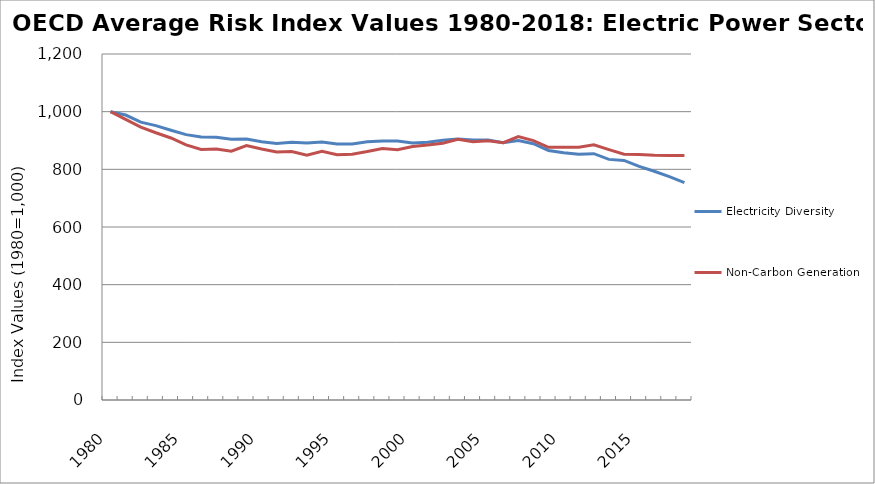
| Category | Electricity Diversity | Non-Carbon Generation |
|---|---|---|
| 1980.0 | 1000 | 1000 |
| 1981.0 | 988.271 | 973.074 |
| 1982.0 | 963.545 | 946.455 |
| 1983.0 | 951.46 | 926.827 |
| 1984.0 | 935.702 | 908.792 |
| 1985.0 | 920.39 | 884.839 |
| 1986.0 | 911.85 | 869.063 |
| 1987.0 | 911.318 | 870.815 |
| 1988.0 | 904.675 | 862.834 |
| 1989.0 | 904.932 | 882.467 |
| 1990.0 | 895.619 | 870.305 |
| 1991.0 | 889.67 | 860.39 |
| 1992.0 | 894.015 | 861.613 |
| 1993.0 | 891.215 | 849.217 |
| 1994.0 | 894.467 | 862.685 |
| 1995.0 | 887.855 | 850.986 |
| 1996.0 | 888.103 | 852.672 |
| 1997.0 | 895.527 | 861.629 |
| 1998.0 | 897.985 | 872.331 |
| 1999.0 | 898.181 | 867.958 |
| 2000.0 | 891.257 | 878.933 |
| 2001.0 | 894.192 | 884.568 |
| 2002.0 | 901.116 | 890.29 |
| 2003.0 | 904.868 | 904.165 |
| 2004.0 | 901.401 | 895.276 |
| 2005.0 | 901.718 | 898.986 |
| 2006.0 | 891.921 | 892.38 |
| 2007.0 | 899.771 | 913.777 |
| 2008.0 | 889.016 | 899.574 |
| 2009.0 | 865.443 | 876.252 |
| 2010.0 | 857.338 | 876.191 |
| 2011.0 | 851.954 | 876.976 |
| 2012.0 | 854.164 | 884.778 |
| 2013.0 | 834.549 | 868.322 |
| 2014.0 | 830.983 | 852.351 |
| 2015.0 | 810.079 | 851.729 |
| 2016.0 | 793.418 | 848.779 |
| 2017.0 | 774.497 | 847.579 |
| 2018.0 | 753.847 | 848.297 |